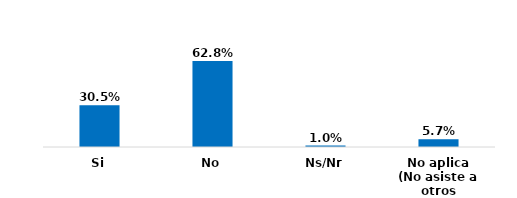
| Category | Series 0 |
|---|---|
| Si | 0.305 |
| No | 0.628 |
| Ns/Nr | 0.01 |
| No aplica (No asiste a otros escenarios) | 0.057 |